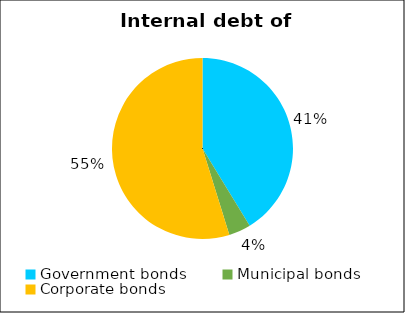
| Category | Series 0 | Series 1 |
|---|---|---|
| Government bonds | 25.6 | 25.6 |
| Municipal bonds | 2.439 | 2.439 |
| Corporate bonds | 33.994 | 33.994 |